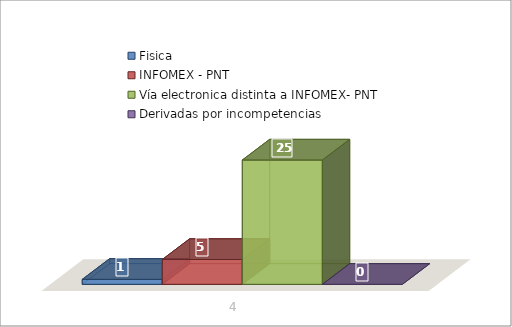
| Category | Fisica | INFOMEX - PNT | Vía electronica distinta a INFOMEX- PNT | Derivadas por incompetencias |
|---|---|---|---|---|
| 0 | 1 | 5 | 25 | 0 |